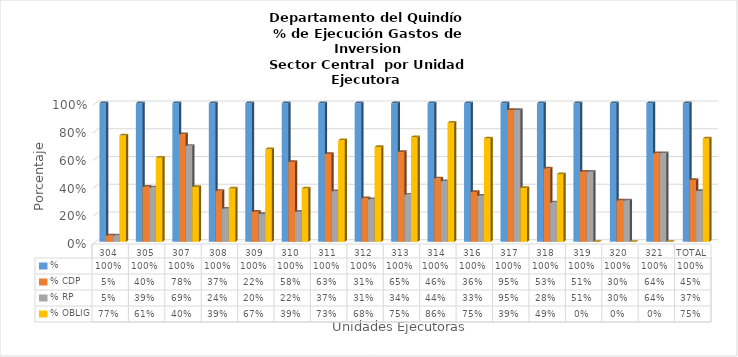
| Category | % | % CDP | % RP | % OBLIG |
|---|---|---|---|---|
| 304 | 1 | 0.046 | 0.046 | 0.767 |
| 305 | 1 | 0.397 | 0.391 | 0.607 |
| 307 | 1 | 0.775 | 0.692 | 0.396 |
| 308 | 1 | 0.368 | 0.239 | 0.385 |
| 309 | 1 | 0.218 | 0.202 | 0.667 |
| 310 | 1 | 0.576 | 0.218 | 0.385 |
| 311 | 1 | 0.633 | 0.365 | 0.732 |
| 312 | 1 | 0.314 | 0.307 | 0.684 |
| 313 | 1 | 0.647 | 0.341 | 0.755 |
| 314 | 1 | 0.458 | 0.437 | 0.859 |
| 316 | 1 | 0.36 | 0.332 | 0.746 |
| 317 | 1 | 0.95 | 0.95 | 0.389 |
| 318 | 1 | 0.529 | 0.283 | 0.488 |
| 319 | 1 | 0.506 | 0.506 | 0 |
| 320 | 1 | 0.299 | 0.299 | 0 |
| 321 | 1 | 0.638 | 0.638 | 0 |
| TOTAL | 1 | 0.447 | 0.367 | 0.745 |